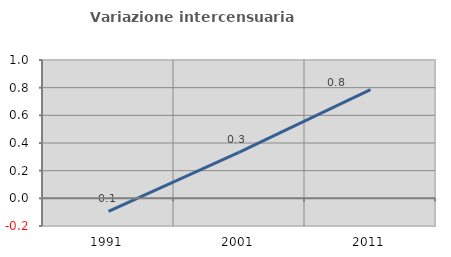
| Category | Variazione intercensuaria annua |
|---|---|
| 1991.0 | -0.095 |
| 2001.0 | 0.334 |
| 2011.0 | 0.785 |